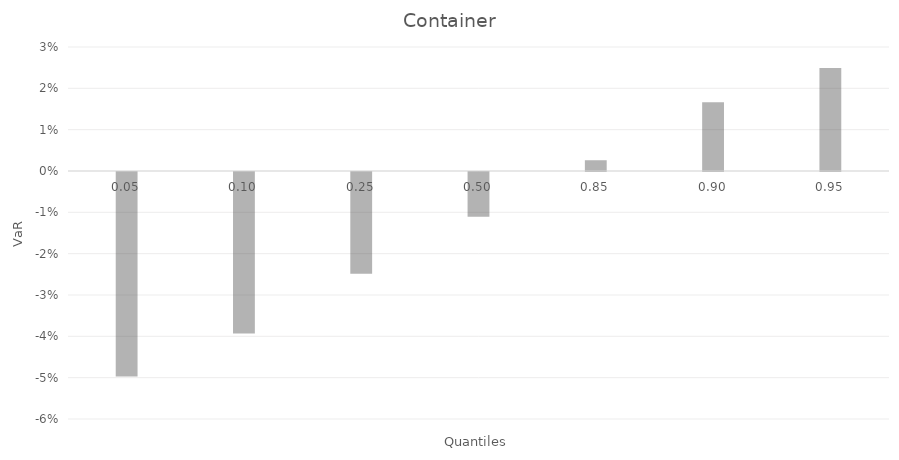
| Category | Series 0 |
|---|---|
| 0.05 | -0.049 |
| 0.1 | -0.039 |
| 0.25 | -0.025 |
| 0.5 | -0.011 |
| 0.85 | 0.003 |
| 0.9 | 0.017 |
| 0.95 | 0.025 |